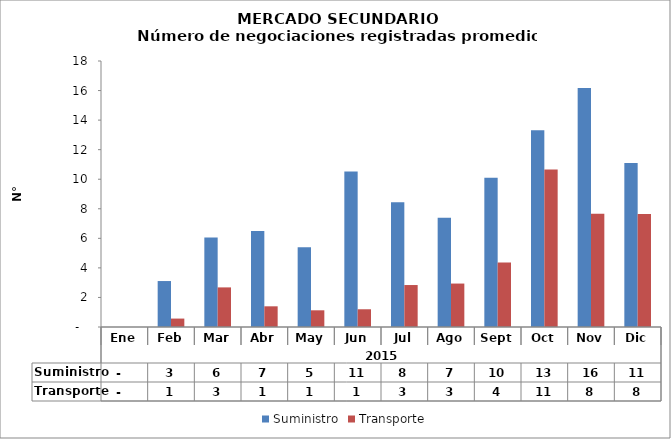
| Category | Suministro | Transporte |
|---|---|---|
| 0 | 0 | 0 |
| 1 | 3.11 | 0.57 |
| 2 | 6.06 | 2.68 |
| 3 | 6.5 | 1.4 |
| 4 | 5.39 | 1.13 |
| 5 | 10.53 | 1.2 |
| 6 | 8.45 | 2.84 |
| 7 | 7.39 | 2.94 |
| 8 | 10.1 | 4.37 |
| 9 | 13.32 | 10.65 |
| 10 | 16.17 | 7.67 |
| 11 | 11.1 | 7.65 |